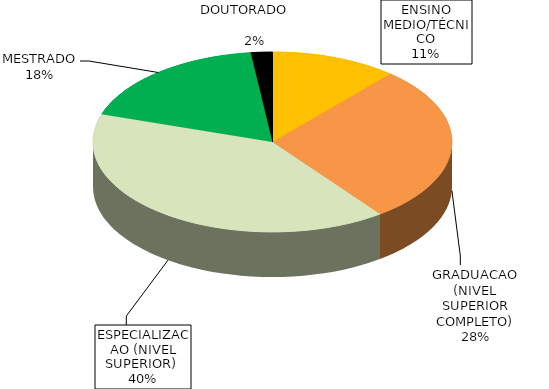
| Category | Series 0 |
|---|---|
| ENSINO MEDIO/TÉCNICO | 0.114 |
| GRADUACAO (NIVEL SUPERIOR COMPLETO) | 0.284 |
| ESPECIALIZACAO (NIVEL SUPERIOR)  | 0.402 |
| MESTRADO | 0.181 |
| DOUTORADO                             | 0.019 |